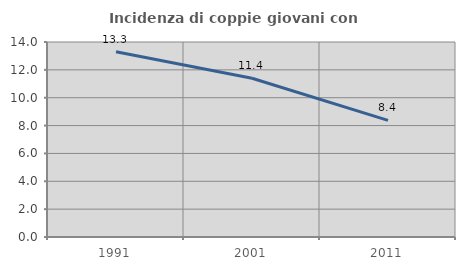
| Category | Incidenza di coppie giovani con figli |
|---|---|
| 1991.0 | 13.298 |
| 2001.0 | 11.399 |
| 2011.0 | 8.377 |